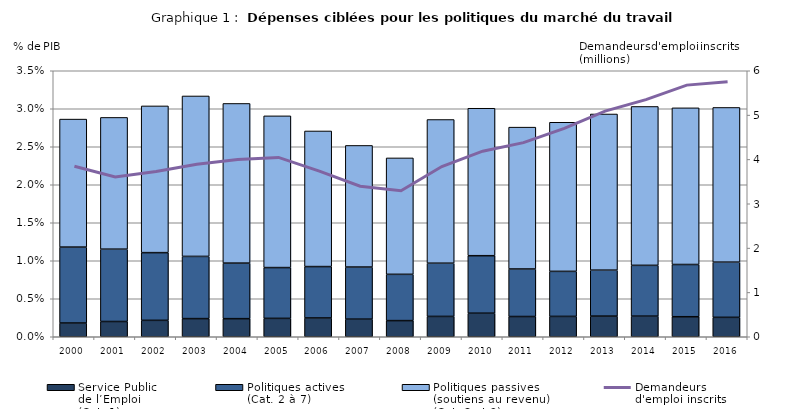
| Category | Service Public 
de l’Emploi 
(Cat. 1) | Politiques actives 
(Cat. 2 à 7) | Politiques passives
(soutiens au revenu)
(Cat. 8 et 9) |
|---|---|---|---|
| 2000.0 | 0.002 | 0.01 | 0.017 |
| 2001.0 | 0.002 | 0.01 | 0.017 |
| 2002.0 | 0.002 | 0.009 | 0.019 |
| 2003.0 | 0.002 | 0.008 | 0.021 |
| 2004.0 | 0.002 | 0.007 | 0.021 |
| 2005.0 | 0.002 | 0.007 | 0.02 |
| 2006.0 | 0.002 | 0.007 | 0.018 |
| 2007.0 | 0.002 | 0.007 | 0.016 |
| 2008.0 | 0.002 | 0.006 | 0.015 |
| 2009.0 | 0.003 | 0.007 | 0.019 |
| 2010.0 | 0.003 | 0.008 | 0.019 |
| 2011.0 | 0.003 | 0.006 | 0.019 |
| 2012.0 | 0.003 | 0.006 | 0.02 |
| 2013.0 | 0.003 | 0.006 | 0.021 |
| 2014.0 | 0.003 | 0.007 | 0.021 |
| 2015.0 | 0.003 | 0.007 | 0.021 |
| 2016.0 | 0.003 | 0.007 | 0.02 |